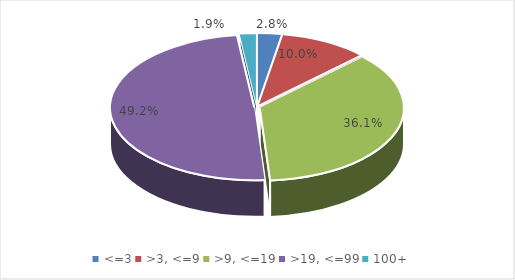
| Category | Schools |
|---|---|
| <=3 | 0.028 |
| >3, <=9 | 0.1 |
| >9, <=19 | 0.361 |
| >19, <=99 | 0.492 |
| 100+ | 0.019 |